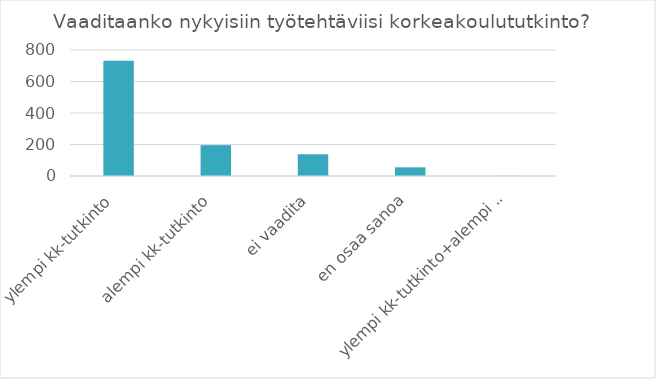
| Category | Summa |
|---|---|
| ylempi kk-tutkinto | 732 |
| alempi kk-tutkinto | 196 |
| ei vaadita | 138 |
| en osaa sanoa | 55 |
| ylempi kk-tutkinto+alempi kk-tutkinto | 1 |